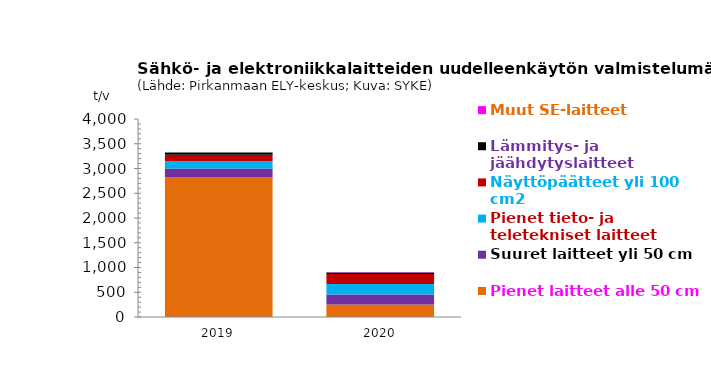
| Category | Pienet laitteet alle 50 cm | Suuret laitteet yli 50 cm | Pienet tieto- ja teletekniset laitteet | Näyttöpäätteet yli 100 cm2 | Lämmitys- ja jäähdytyslaitteet | Muut SE-laitteet |
|---|---|---|---|---|---|---|
| 2019.0 | 2819.567 | 179.86 | 148.61 | 131.81 | 41.53 | 0.3 |
| 2020.0 | 252.541 | 199.996 | 215.753 | 202.38 | 30.73 | 0.302 |